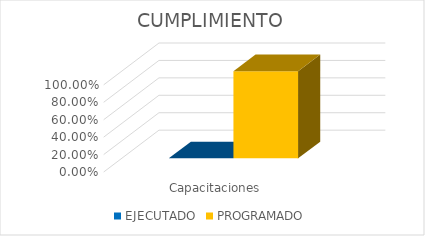
| Category | EJECUTADO | PROGRAMADO |
|---|---|---|
| Capacitaciones | 0 | 1 |